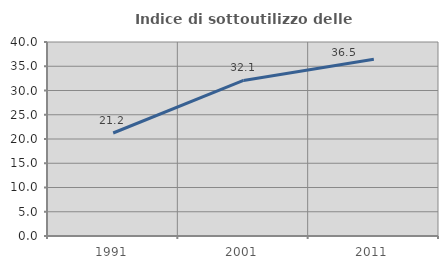
| Category | Indice di sottoutilizzo delle abitazioni  |
|---|---|
| 1991.0 | 21.239 |
| 2001.0 | 32.08 |
| 2011.0 | 36.46 |